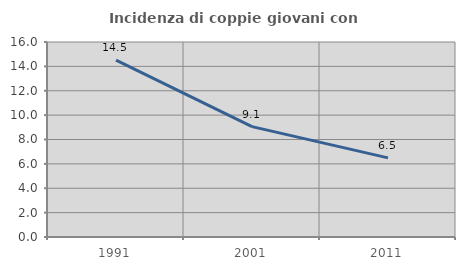
| Category | Incidenza di coppie giovani con figli |
|---|---|
| 1991.0 | 14.506 |
| 2001.0 | 9.056 |
| 2011.0 | 6.495 |